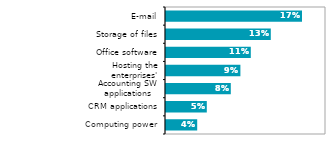
| Category | Series 0 |
|---|---|
| Computing power | 0.039 |
| CRM applications | 0.051 |
| Accounting SW applications | 0.081 |
| Hosting the enterprises' databases | 0.093 |
| Office software | 0.106 |
| Storage of files | 0.131 |
| E-mail | 0.17 |